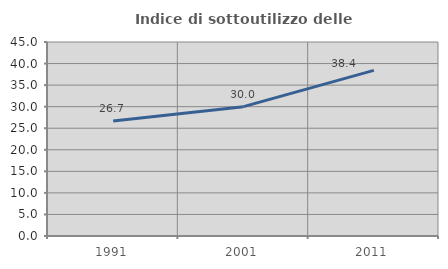
| Category | Indice di sottoutilizzo delle abitazioni  |
|---|---|
| 1991.0 | 26.697 |
| 2001.0 | 30 |
| 2011.0 | 38.406 |